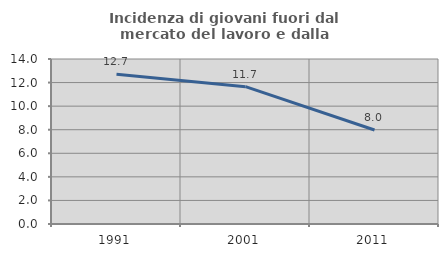
| Category | Incidenza di giovani fuori dal mercato del lavoro e dalla formazione  |
|---|---|
| 1991.0 | 12.712 |
| 2001.0 | 11.655 |
| 2011.0 | 7.977 |